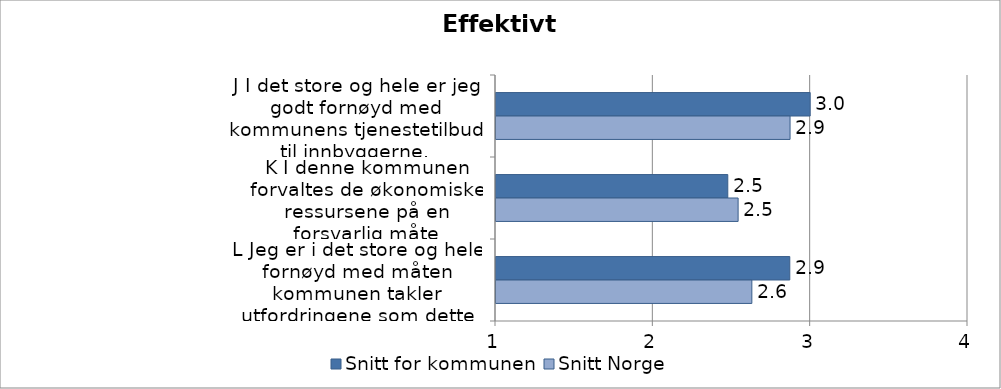
| Category | Snitt for kommunen | Snitt Norge |
|---|---|---|
| J I det store og hele er jeg godt fornøyd med kommunens tjenestetilbud til innbyggerne. | 2.997 | 2.869 |
| K I denne kommunen forvaltes de økonomiske ressursene på en forsvarlig måte | 2.473 | 2.539 |
| L Jeg er i det store og hele fornøyd med måten kommunen takler utfordringene som dette lokalsamfunnet står overfor | 2.867 | 2.626 |